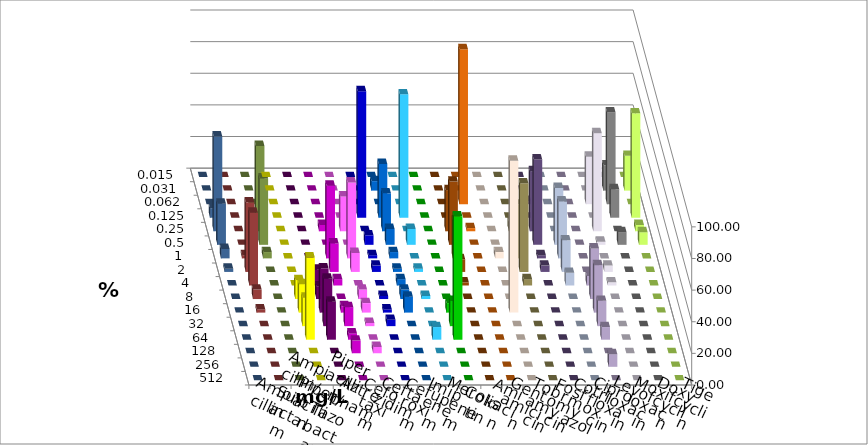
| Category | Ampicillin | Ampicillin/ Sulbactam | Piperacillin | Piperacillin/ Tazobactam | Aztreonam | Cefotaxim | Ceftazidim | Cefuroxim | Imipenem | Meropenem | Colistin | Amikacin | Gentamicin | Tobramycin | Fosfomycin | Cotrimoxazol | Ciprofloxacin | Levofloxacin | Moxifloxacin | Doxycyclin | Tigecyclin |
|---|---|---|---|---|---|---|---|---|---|---|---|---|---|---|---|---|---|---|---|---|---|
| 0.015 | 0 | 0 | 0 | 0 | 0 | 0 | 0 | 0 | 0 | 0 | 0 | 0 | 0 | 0 | 0 | 0 | 0 | 0 | 0 | 0 | 0 |
| 0.031 | 0 | 0 | 0 | 0 | 0 | 6 | 0 | 0 | 0 | 0 | 0 | 0 | 0 | 0 | 0 | 0 | 16 | 22 | 0 | 0 | 0 |
| 0.062 | 0 | 0 | 0 | 0 | 0 | 0 | 0 | 0 | 0 | 98 | 0 | 0 | 2 | 0 | 0 | 30 | 58 | 0 | 0 | 0 | 0 |
| 0.125 | 0 | 0 | 0 | 0 | 80 | 34 | 78 | 0 | 0 | 0 | 0 | 0 | 0 | 0 | 0 | 0 | 18 | 66 | 6 | 0 | 0 |
| 0.25 | 0 | 0 | 4 | 22 | 0 | 24 | 0 | 0 | 26 | 2 | 0 | 6 | 38 | 0 | 0 | 62 | 0 | 4 | 60 | 0 | 54 |
| 0.5 | 0 | 0 | 0 | 0 | 6 | 10 | 10 | 0 | 40 | 0 | 0 | 0 | 54 | 36 | 0 | 2 | 8 | 8 | 26 | 0 | 42 |
| 1.0 | 0 | 0 | 46 | 48 | 2 | 4 | 0 | 0 | 24 | 0 | 4 | 34 | 2 | 36 | 0 | 0 | 0 | 0 | 6 | 2 | 4 |
| 2.0 | 0 | 0 | 18 | 12 | 4 | 2 | 2 | 0 | 8 | 0 | 0 | 56 | 4 | 20 | 0 | 4 | 0 | 0 | 2 | 44 | 0 |
| 4.0 | 0 | 10 | 4 | 0 | 0 | 4 | 0 | 0 | 2 | 0 | 0 | 4 | 0 | 8 | 6 | 2 | 0 | 0 | 0 | 46 | 0 |
| 8.0 | 12 | 8 | 0 | 6 | 2 | 6 | 2 | 0 | 0 | 0 | 0 | 0 | 0 | 0 | 32 | 0 | 0 | 0 | 0 | 6 | 0 |
| 16.0 | 18 | 28 | 4 | 6 | 2 | 10 | 0 | 6 | 0 | 0 | 96 | 0 | 0 | 0 | 30 | 0 | 0 | 0 | 0 | 2 | 0 |
| 32.0 | 18 | 30 | 12 | 2 | 4 | 0 | 0 | 16 | 0 | 0 | 0 | 0 | 0 | 0 | 16 | 0 | 0 | 0 | 0 | 0 | 0 |
| 64.0 | 52 | 24 | 4 | 0 | 0 | 0 | 8 | 78 | 0 | 0 | 0 | 0 | 0 | 0 | 8 | 0 | 0 | 0 | 0 | 0 | 0 |
| 128.0 | 0 | 0 | 8 | 4 | 0 | 0 | 0 | 0 | 0 | 0 | 0 | 0 | 0 | 0 | 0 | 0 | 0 | 0 | 0 | 0 | 0 |
| 256.0 | 0 | 0 | 0 | 0 | 0 | 0 | 0 | 0 | 0 | 0 | 0 | 0 | 0 | 0 | 8 | 0 | 0 | 0 | 0 | 0 | 0 |
| 512.0 | 0 | 0 | 0 | 0 | 0 | 0 | 0 | 0 | 0 | 0 | 0 | 0 | 0 | 0 | 0 | 0 | 0 | 0 | 0 | 0 | 0 |